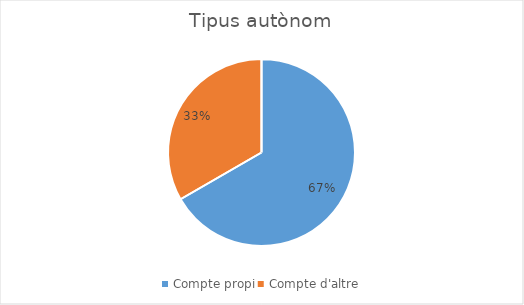
| Category | Series 0 |
|---|---|
| Compte propi | 2 |
| Compte d'altre | 1 |